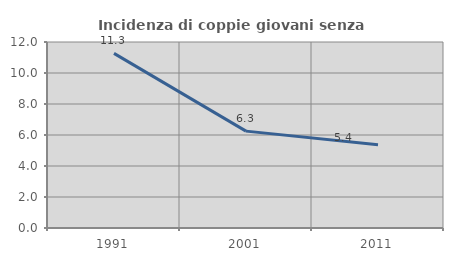
| Category | Incidenza di coppie giovani senza figli |
|---|---|
| 1991.0 | 11.268 |
| 2001.0 | 6.25 |
| 2011.0 | 5.376 |